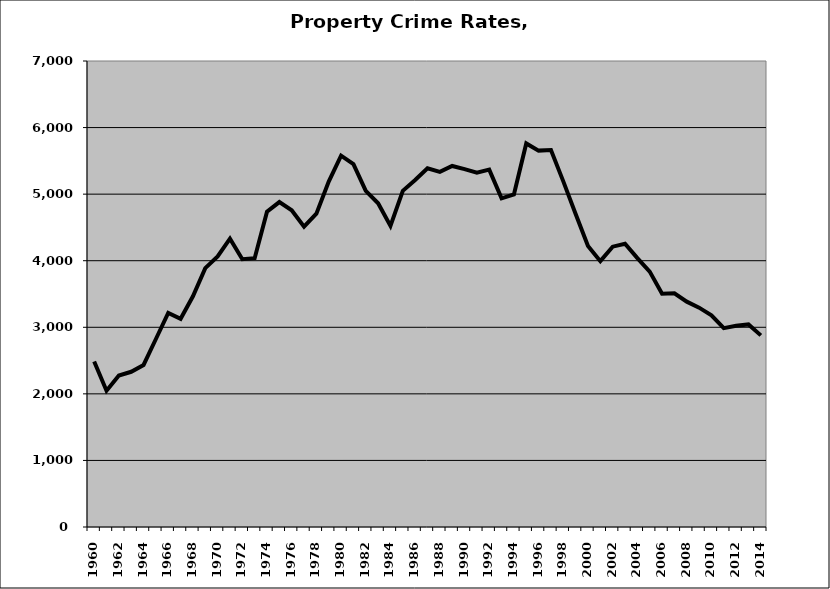
| Category | Property |
|---|---|
| 1960.0 | 2487.012 |
| 1961.0 | 2047.926 |
| 1962.0 | 2275.595 |
| 1963.0 | 2331.536 |
| 1964.0 | 2434.375 |
| 1965.0 | 2824.141 |
| 1966.0 | 3216.369 |
| 1967.0 | 3127.832 |
| 1968.0 | 3465.764 |
| 1969.0 | 3888.23 |
| 1970.0 | 4063.919 |
| 1971.0 | 4332.12 |
| 1972.0 | 4023.179 |
| 1973.0 | 4038.634 |
| 1974.0 | 4735.635 |
| 1975.0 | 4880.846 |
| 1976.0 | 4757.166 |
| 1977.0 | 4510.647 |
| 1978.0 | 4707.116 |
| 1979.0 | 5187.857 |
| 1980.0 | 5577.253 |
| 1981.0 | 5451.385 |
| 1982.0 | 5048.327 |
| 1983.0 | 4861.952 |
| 1984.0 | 4521.973 |
| 1985.0 | 5049.97 |
| 1986.0 | 5211.652 |
| 1987.0 | 5388.81 |
| 1988.0 | 5335.482 |
| 1989.0 | 5423.374 |
| 1990.0 | 5375.976 |
| 1991.0 | 5320.791 |
| 1992.0 | 5368.009 |
| 1993.0 | 4936.344 |
| 1994.0 | 4996.436 |
| 1995.0 | 5762.019 |
| 1996.0 | 5653.95 |
| 1997.0 | 5661.438 |
| 1998.0 | 5191.667 |
| 1999.0 | 4701.301 |
| 2000.0 | 4220.325 |
| 2001.0 | 3993.177 |
| 2002.0 | 4210.862 |
| 2003.0 | 4255.057 |
| 2004.0 | 4038.571 |
| 2005.0 | 3836.674 |
| 2006.0 | 3505.325 |
| 2007.0 | 3510.11 |
| 2008.0 | 3385.236 |
| 2009.0 | 3294.977 |
| 2010.0 | 3179.582 |
| 2011.0 | 2987.691 |
| 2012.0 | 3022.343 |
| 2013.0 | 3043.075 |
| 2014.0 | 2878.485 |